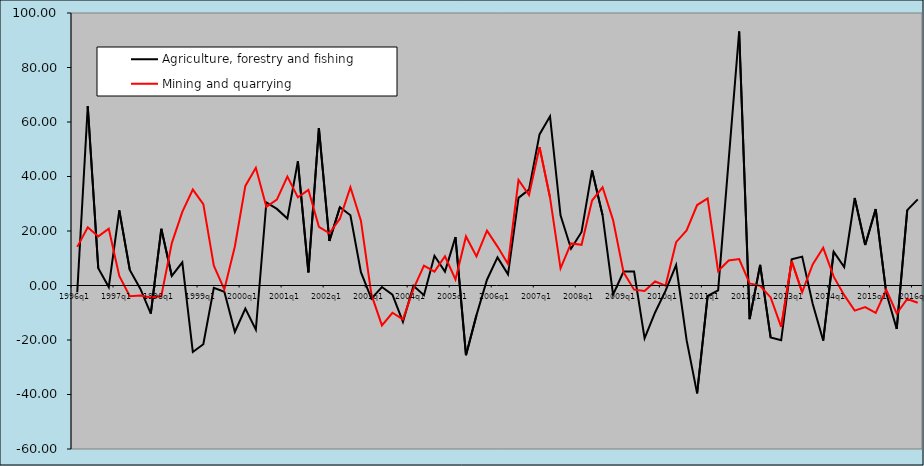
| Category | Agriculture, forestry and fishing | Mining and quarrying |
|---|---|---|
| 1996q1 | -2.496 | 14.178 |
| 1996q2 | 65.789 | 21.353 |
| 1996q3 | 6.338 | 18.009 |
| 1996q4 | -0.563 | 20.823 |
| 1997q1 | 27.594 | 3.486 |
| 1997q2 | 5.712 | -3.929 |
| 1997q3 | -1.185 | -3.65 |
| 1997q4 | -10.356 | -4.354 |
| 1998q1 | 20.799 | -3.887 |
| 1998q2 | 3.509 | 15.559 |
| 1998q3 | 8.512 | 27.014 |
| 1998q4 | -24.385 | 35.203 |
| 1999q1 | -21.543 | 29.889 |
| 1999q2 | -0.866 | 7.263 |
| 1999q3 | -2.306 | -1.463 |
| 1999q4 | -17.061 | 14.339 |
| 2000q1 | -8.451 | 36.533 |
| 2000q2 | -16.186 | 43.179 |
| 2000q3 | 30.476 | 28.866 |
| 2000q4 | 28.112 | 31.544 |
| 2001q1 | 24.55 | 39.966 |
| 2001q2 | 45.582 | 32.347 |
| 2001q3 | 4.796 | 35.113 |
| 2001q4 | 57.734 | 21.527 |
| 2002q1 | 16.339 | 19.173 |
| 2002q2 | 28.722 | 24.517 |
| 2002q3 | 25.786 | 36.089 |
| 2002q4 | 4.877 | 23.767 |
| 2003q1 | -4.792 | -3.355 |
| 2003q2 | -0.559 | -14.656 |
| 2003q3 | -3.36 | -10.001 |
| 2003q4 | -13.327 | -12.457 |
| 2004q1 | -0.118 | -1.265 |
| 2004q2 | -3.541 | 7.319 |
| 2004q3 | 10.895 | 5.071 |
| 2004q4 | 5.096 | 10.74 |
| 2005q1 | 17.755 | 2.216 |
| 2005q2 | -25.56 | 18.007 |
| 2005q3 | -10.872 | 10.642 |
| 2005q4 | 2.125 | 20.115 |
| 2006q1 | 10.313 | 14.277 |
| 2006q2 | 4.074 | 7.9 |
| 2006q3 | 32.15 | 38.705 |
| 2006q4 | 35.187 | 33.186 |
| 2007q1 | 55.44 | 50.787 |
| 2007q2 | 62.092 | 32.266 |
| 2007q3 | 25.745 | 6.266 |
| 2007q4 | 13.506 | 15.436 |
| 2008q1 | 19.635 | 14.942 |
| 2008q2 | 42.253 | 31.169 |
| 2008q3 | 25.821 | 36.033 |
| 2008q4 | -3.374 | 23.997 |
| 2009q1 | 5.15 | 4.822 |
| 2009q2 | 5.132 | -1.533 |
| 2009q3 | -19.394 | -2.041 |
| 2009q4 | -9.901 | 1.482 |
| 2010q1 | -1.898 | -0.027 |
| 2010q2 | 7.512 | 15.906 |
| 2010q3 | -20.069 | 20.223 |
| 2010q4 | -39.607 | 29.522 |
| 2011q1 | -3.854 | 31.934 |
| 2011q2 | -1.799 | 5.3 |
| 2011q3 | 45.809 | 9.186 |
| 2011q4 | 93.22 | 9.681 |
| 2012q1 | -12.337 | 0.77 |
| 2012q2 | 7.578 | -0.121 |
| 2012q3 | -19.095 | -4.369 |
| 2012q4 | -20.115 | -15.202 |
| 2013q1 | 9.624 | 8.96 |
| 2013q2 | 10.605 | -2.468 |
| 2013q3 | -6.714 | 7.731 |
| 2013q4 | -20.209 | 13.835 |
| 2014q1 | 12.396 | 3.244 |
| 2014q2 | 6.797 | -3.548 |
| 2014q3 | 32.119 | -9.213 |
| 2014q4 | 14.896 | -7.925 |
| 2015q1 | 28.068 | -10.029 |
| 2015q2 | -2.705 | -1.546 |
| 2015q3 | -15.951 | -10.276 |
| 2015q4 | 27.674 | -4.936 |
| 2016q1 | 31.609 | -6.308 |